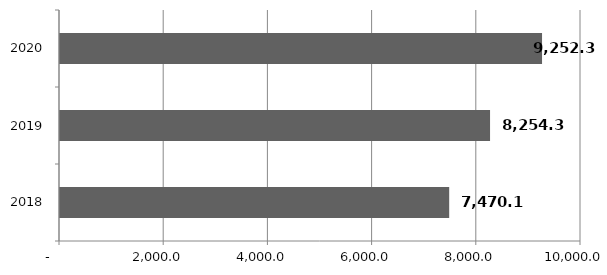
| Category | Series 0 |
|---|---|
| 2018.0 | 7470.085 |
| 2019.0 | 8254.3 |
| 2020.0 | 9252.3 |